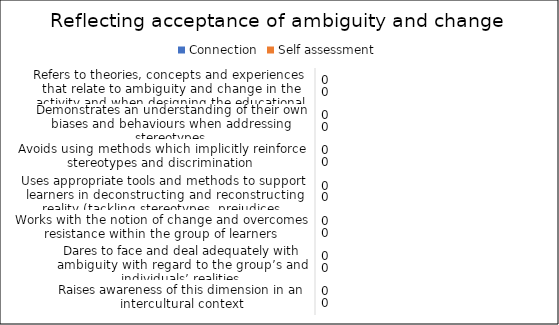
| Category | Connection | Self assessment |
|---|---|---|
| Refers to theories, concepts and experiences that relate to ambiguity and change in the activity and when designing the educational approach  | 0 | 0 |
| Demonstrates an understanding of their own biases and behaviours when addressing stereotypes | 0 | 0 |
| Avoids using methods which implicitly reinforce stereotypes and discrimination  | 0 | 0 |
| Uses appropriate tools and methods to support learners in deconstructing and reconstructing reality (tackling stereotypes, prejudices, assumptions, etc.) | 0 | 0 |
| Works with the notion of change and overcomes resistance within the group of learners | 0 | 0 |
| Dares to face and deal adequately with ambiguity with regard to the group’s and individuals’ realities | 0 | 0 |
| Raises awareness of this dimension in an intercultural context | 0 | 0 |